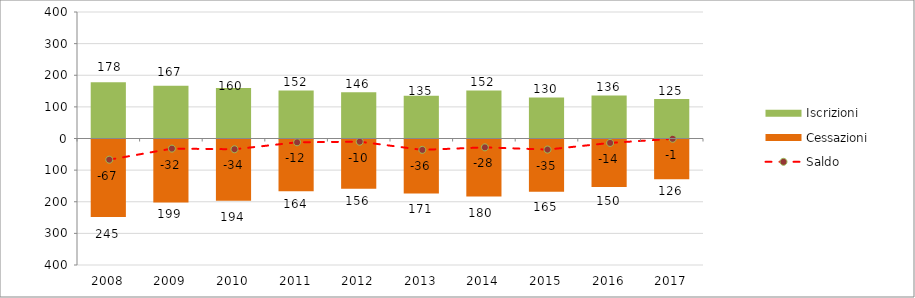
| Category | Iscrizioni | Cessazioni |
|---|---|---|
| 2008.0 | 178 | -245 |
| 2009.0 | 167 | -199 |
| 2010.0 | 160 | -194 |
| 2011.0 | 152 | -164 |
| 2012.0 | 146 | -156 |
| 2013.0 | 135 | -171 |
| 2014.0 | 152 | -180 |
| 2015.0 | 130 | -165 |
| 2016.0 | 136 | -150 |
| 2017.0 | 125 | -126 |